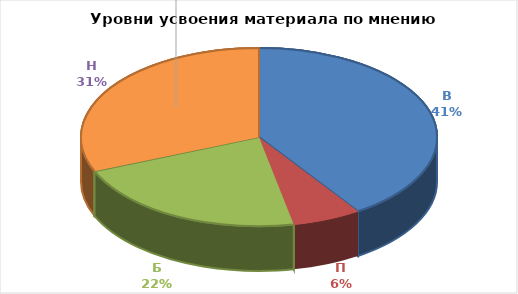
| Category | Series 0 |
|---|---|
| В | 13 |
| П | 2 |
| Б | 7 |
| Н | 10 |